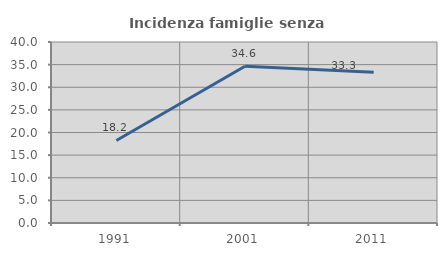
| Category | Incidenza famiglie senza nuclei |
|---|---|
| 1991.0 | 18.248 |
| 2001.0 | 34.641 |
| 2011.0 | 33.333 |